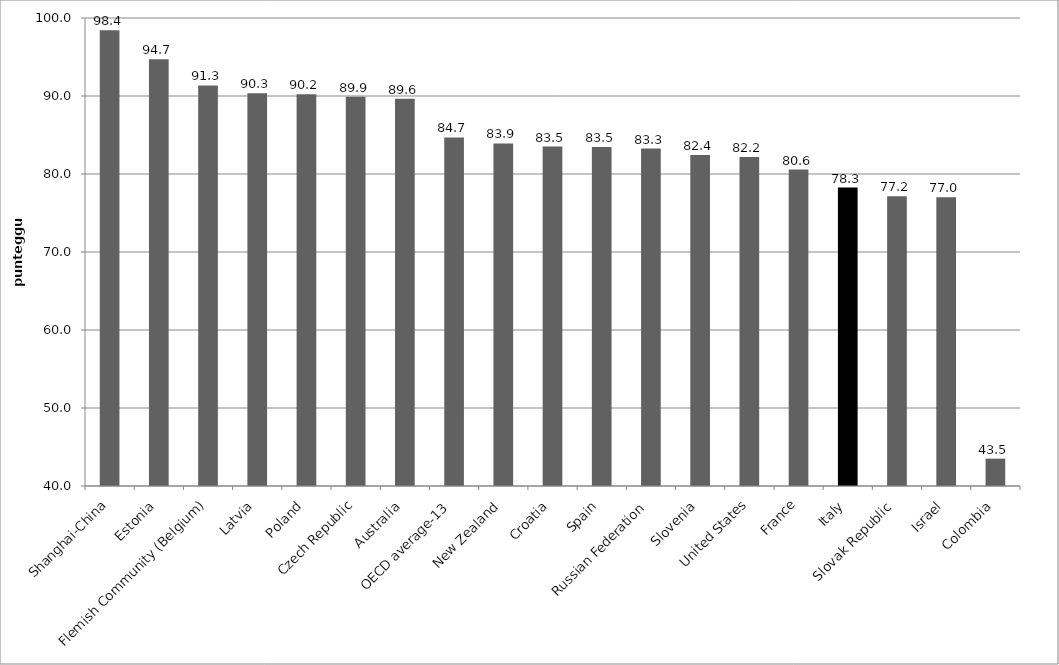
| Category | Series 0 |
|---|---|
| Shanghai-China | 98.44 |
| Estonia | 94.728 |
| Flemish Community (Belgium) | 91.349 |
| Latvia | 90.341 |
| Poland | 90.232 |
| Czech Republic | 89.898 |
| Australia | 89.636 |
| OECD average-13 | 84.681 |
| New Zealand | 83.921 |
| Croatia | 83.522 |
| Spain | 83.467 |
| Russian Federation | 83.257 |
| Slovenia | 82.438 |
| United States | 82.168 |
| France | 80.565 |
| Italy | 78.268 |
| Slovak Republic | 77.159 |
| Israel | 77.029 |
| Colombia | 43.508 |